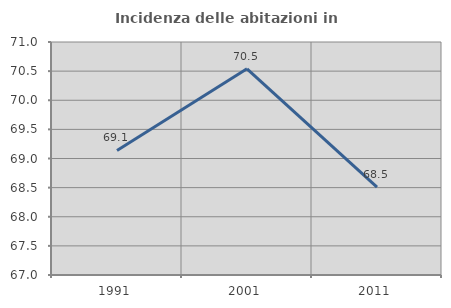
| Category | Incidenza delle abitazioni in proprietà  |
|---|---|
| 1991.0 | 69.138 |
| 2001.0 | 70.54 |
| 2011.0 | 68.507 |